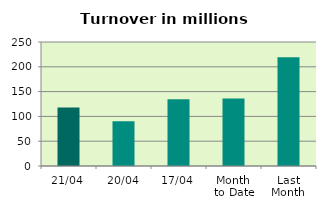
| Category | Series 0 |
|---|---|
| 21/04 | 117.701 |
| 20/04 | 90.32 |
| 17/04 | 134.484 |
| Month 
to Date | 135.865 |
| Last
Month | 219.362 |